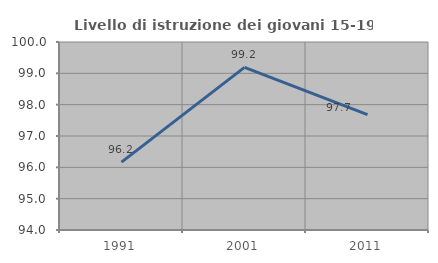
| Category | Livello di istruzione dei giovani 15-19 anni |
|---|---|
| 1991.0 | 96.166 |
| 2001.0 | 99.189 |
| 2011.0 | 97.68 |